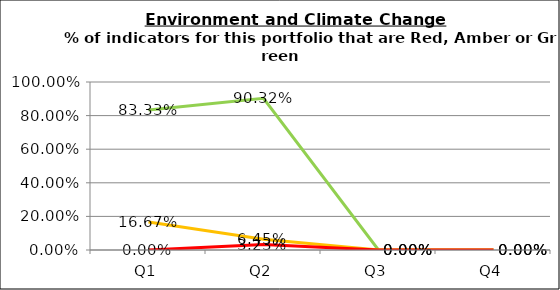
| Category | Green | Amber | Red |
|---|---|---|---|
| Q1 | 0.833 | 0.167 | 0 |
| Q2 | 0.903 | 0.065 | 0.032 |
| Q3 | 0 | 0 | 0 |
| Q4 | 0 | 0 | 0 |